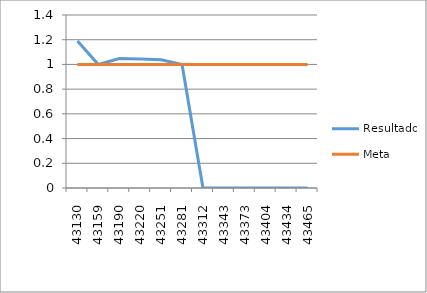
| Category | Resultado | Meta |
|---|---|---|
| 43130.0 | 1.19 | 1 |
| 43159.0 | 1 | 1 |
| 43190.0 | 1.048 | 1 |
| 43220.0 | 1.043 | 1 |
| 43251.0 | 1.037 | 1 |
| 43281.0 | 1 | 1 |
| 43312.0 | 0 | 1 |
| 43343.0 | 0 | 1 |
| 43373.0 | 0 | 1 |
| 43404.0 | 0 | 1 |
| 43434.0 | 0 | 1 |
| 43465.0 | 0 | 1 |